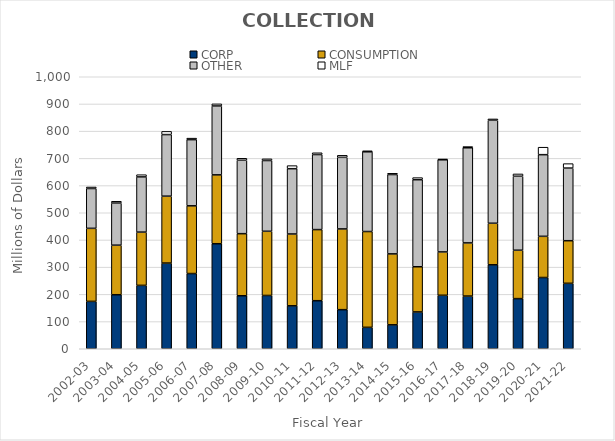
| Category | CORP | CONSUMPTION | OTHER | MLF |
|---|---|---|---|---|
| 2002-03 | 174.2 | 268.5 | 146.4 | 5.6 |
| 2003-04 | 198.6 | 182.2 | 154.9 | 6.6 |
| 2004-05 | 233 | 195.8 | 203 | 8.1 |
| 2005-06 | 315 | 246 | 226.4 | 11.8 |
| 2006-07 | 276.5 | 249 | 243.3 | 5.5 |
| 2007-08 | 386.1 | 253.2 | 253.3 | 7.7 |
| 2008-09 | 194.8 | 228.3 | 269.9 | 7.3 |
| 2009-10 | 195.9 | 236 | 260.1 | 6.2 |
| 2010-11 | 157.9 | 264 | 240.1 | 11.299 |
| 2011-12 | 176.7 | 261.4 | 275.9 | 6.5 |
| 2012-13 | 143.7 | 296.8 | 263.2 | 7.5 |
| 2013-14 | 78.7 | 352.3 | 293 | 3.793 |
| 2014-15 | 87.973 | 260.817 | 291.667 | 4.7 |
| 2015-16 | 135.298 | 166.143 | 320.107 | 7.6 |
| 2016-17 | 196.577 | 159.365 | 338.852 | 2.9 |
| 2017-18 | 193.688 | 195.403 | 349.863 | 4.42 |
| 2018-19 | 308.7 | 152.7 | 378.6 | 4.9 |
| 2019-20 | 184.3 | 178 | 272 | 8.4 |
| 2020-21 | 261.94 | 151.42 | 300.217 | 27.447 |
| 2021-22 | 240.614 | 156.662 | 266.941 | 16.444 |